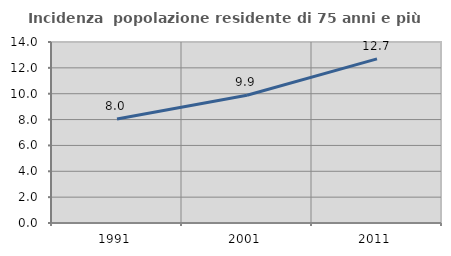
| Category | Incidenza  popolazione residente di 75 anni e più |
|---|---|
| 1991.0 | 8.045 |
| 2001.0 | 9.884 |
| 2011.0 | 12.693 |